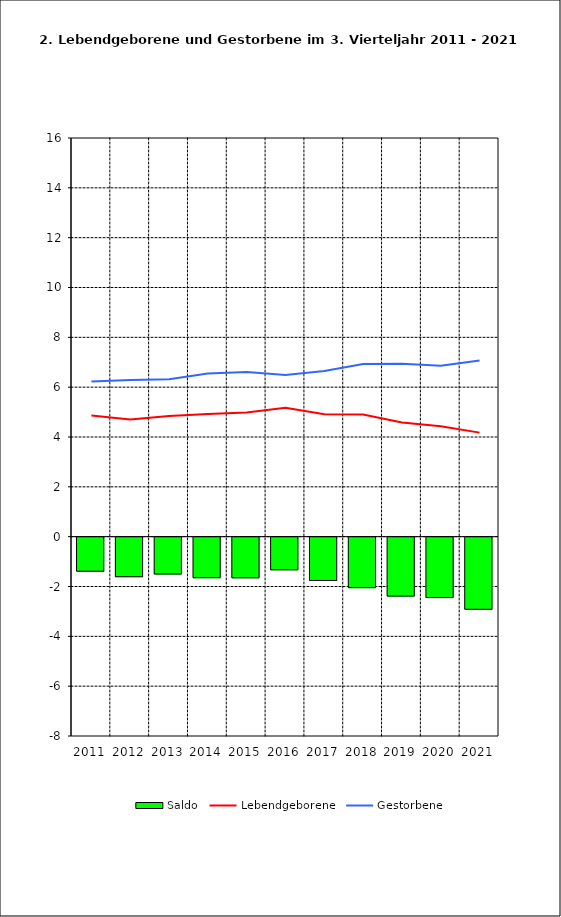
| Category | Saldo |
|---|---|
| 2011.0 | -1.366 |
| 2012.0 | -1.587 |
| 2013.0 | -1.48 |
| 2014.0 | -1.627 |
| 2015.0 | -1.632 |
| 2016.0 | -1.311 |
| 2017.0 | -1.739 |
| 2018.0 | -2.026 |
| 2019.0 | -2.364 |
| 2020.0 | -2.424 |
| 2021.0 | -2.895 |